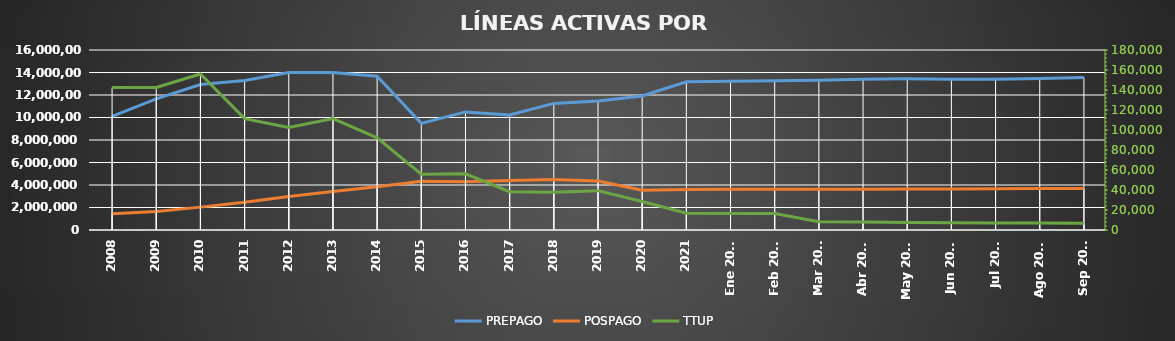
| Category | PREPAGO | POSPAGO |
|---|---|---|
| 2008 | 10097768 | 1452088 |
| 2009 | 11662294 | 1649838 |
| 2010 | 12929040 | 2033814 |
| 2011 | 13295834 | 2467378 |
| 2012 | 14008104 | 2976194 |
| 2013 | 14005126 | 3425277 |
| 2014 | 13666071 | 3846271 |
| 2015 | 9476240 | 4326937 |
| 2016 | 10498467 | 4293426 |
| 2017 | 10219457 | 4393703 |
| 2018 | 11254168 | 4480975 |
| 2019 | 11462048 | 4351686 |
| 2020 | 11917697 | 3539192 |
| 2021 | 13174530 | 3598383 |
| Ene 2022 | 13220510 | 3611202 |
| Feb 2022 | 13277237 | 3612124 |
| Mar 2022 | 13319621 | 3621700 |
| Abr 2022 | 13391496 | 3628201 |
| May 2022 | 13434704 | 3642700 |
| Jun 2022 | 13396249 | 3652440 |
| Jul 2022 | 13410009 | 3668962 |
| Ago 2022 | 13466342 | 3682408 |
| Sep 2022 | 13550174 | 3696591 |